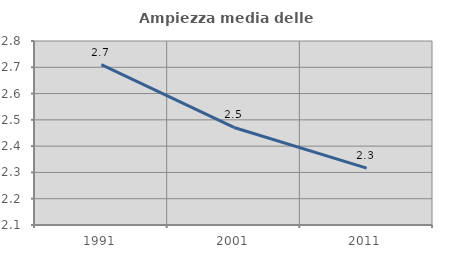
| Category | Ampiezza media delle famiglie |
|---|---|
| 1991.0 | 2.71 |
| 2001.0 | 2.471 |
| 2011.0 | 2.317 |